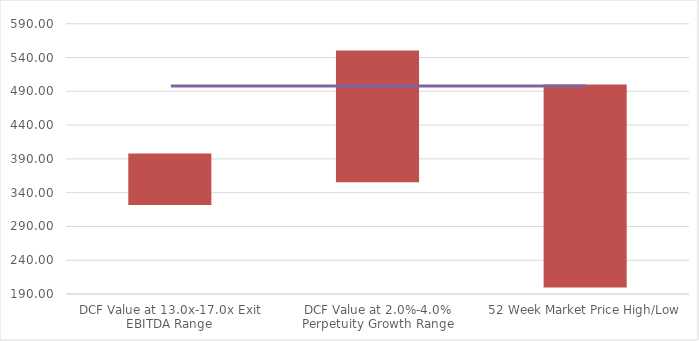
| Category | Series 0 | Series 1 | Series 2 |
|---|---|---|---|
| DCF Value at 13.0x-17.0x Exit EBITDA Range | 323.268 | 74.796 | 398.064 |
| DCF Value at 2.0%-4.0% Perpetuity Growth Range | 356.909 | 193.528 | 550.437 |
| 52 Week Market Price High/Low | 201 | 299 | 500 |